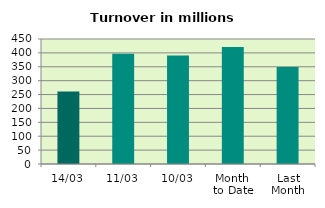
| Category | Series 0 |
|---|---|
| 14/03 | 261.28 |
| 11/03 | 396.884 |
| 10/03 | 390.817 |
| Month 
to Date | 420.843 |
| Last
Month | 349.641 |